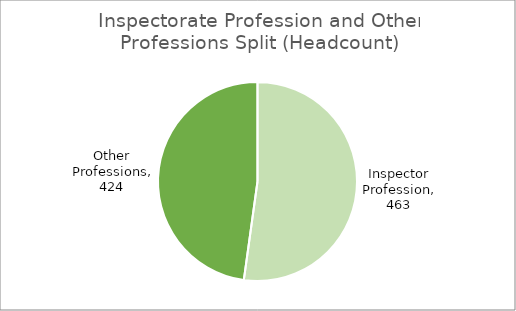
| Category | Headcount |
|---|---|
| Inspector Profession | 463 |
| Other Professions | 424 |